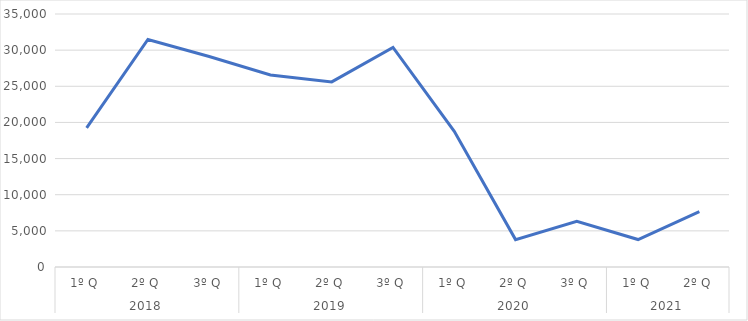
| Category | Series 0 |
|---|---|
| 0 | 19237 |
| 1 | 31481 |
| 2 | 29113 |
| 3 | 26567 |
| 4 | 25606 |
| 5 | 30379 |
| 6 | 18776 |
| 7 | 3790 |
| 8 | 6333 |
| 9 | 3796 |
| 10 | 7645 |